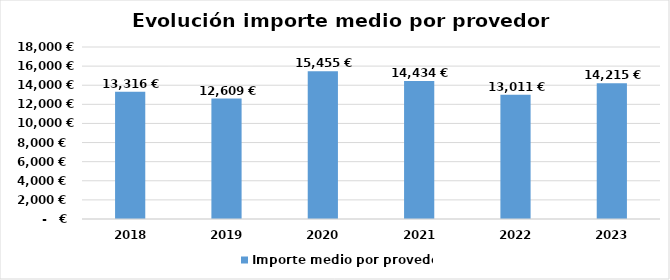
| Category | Importe medio por provedor |
|---|---|
| 2018.0 | 13316.472 |
| 2019.0 | 12608.521 |
| 2020.0 | 15455.475 |
| 2021.0 | 14434.42 |
| 2022.0 | 13010.65 |
| 2023.0 | 14214.81 |